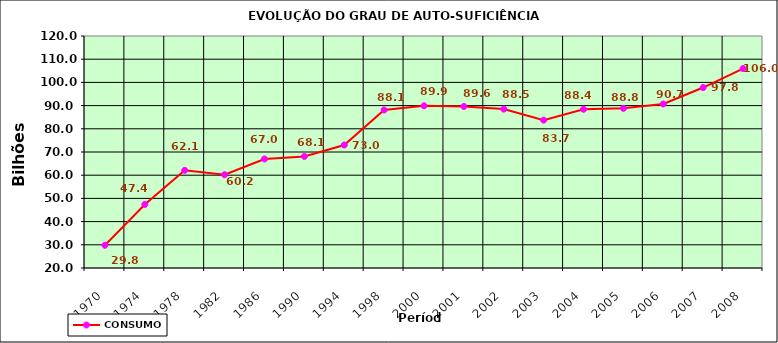
| Category | CONSUMO |
|---|---|
| 1970.0 | 29.8 |
| 1974.0 | 47.4 |
| 1978.0 | 62.1 |
| 1982.0 | 60.2 |
| 1986.0 | 67 |
| 1990.0 | 68.1 |
| 1994.0 | 73 |
| 1998.0 | 88.1 |
| 2000.0 | 89.93 |
| 2001.0 | 89.625 |
| 2002.0 | 88.497 |
| 2003.0 | 83.734 |
| 2004.0 | 88.42 |
| 2005.0 | 88.807 |
| 2006.0 | 90.673 |
| 2007.0 | 97.786 |
| 2008.0 | 105.973 |